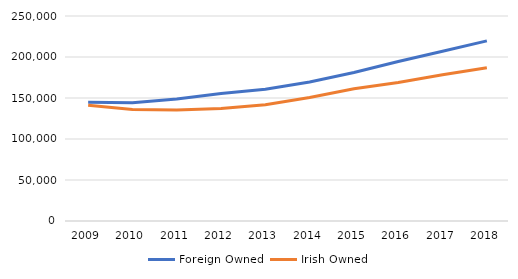
| Category | Foreign Owned | Irish Owned |
|---|---|---|
| 2009.0 | 144844 | 141268 |
| 2010.0 | 144102 | 136068 |
| 2011.0 | 148801 | 135501 |
| 2012.0 | 155512 | 137200 |
| 2013.0 | 160786 | 141799 |
| 2014.0 | 169538 | 150615 |
| 2015.0 | 181145 | 161200 |
| 2016.0 | 194464 | 168799 |
| 2017.0 | 206994 | 178247 |
| 2018.0 | 219672 | 186848 |